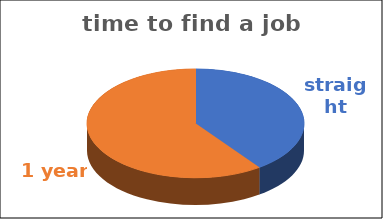
| Category | time to find a job | Series 1 | Series 2 | Series 3 | Series 4 |
|---|---|---|---|---|---|
| straight away | 0.4 |  |  |  |  |
| 1 year | 0.6 |  |  |  |  |